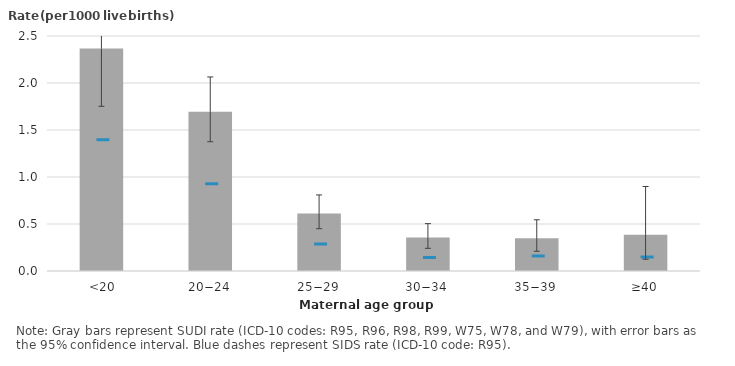
| Category | SUDI |
|---|---|
|  <20 | 2.368 |
| 20−24 | 1.694 |
| 25−29 | 0.61 |
| 30−34 | 0.355 |
| 35−39 | 0.349 |
| ≥40 | 0.385 |